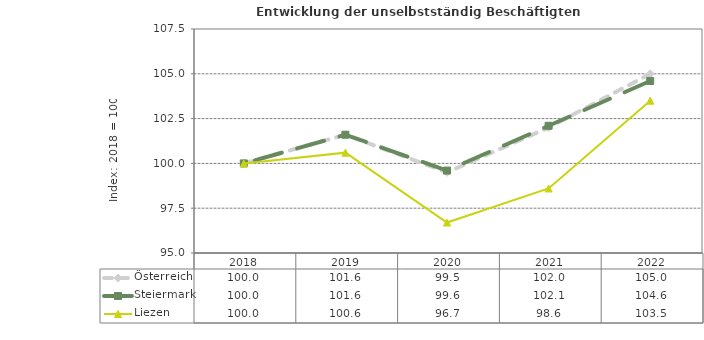
| Category | Österreich | Steiermark | Liezen |
|---|---|---|---|
| 2022.0 | 105 | 104.6 | 103.5 |
| 2021.0 | 102 | 102.1 | 98.6 |
| 2020.0 | 99.5 | 99.6 | 96.7 |
| 2019.0 | 101.6 | 101.6 | 100.6 |
| 2018.0 | 100 | 100 | 100 |